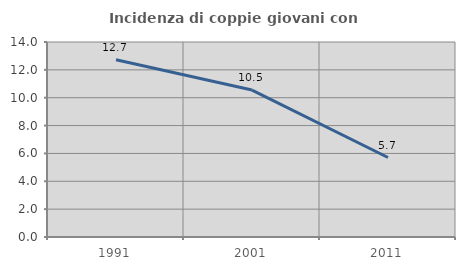
| Category | Incidenza di coppie giovani con figli |
|---|---|
| 1991.0 | 12.731 |
| 2001.0 | 10.549 |
| 2011.0 | 5.707 |